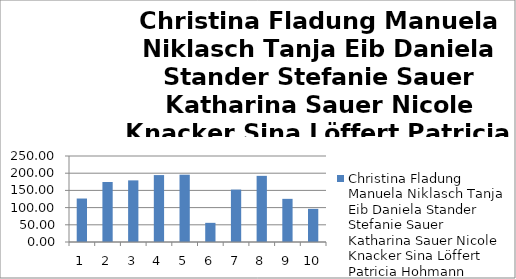
| Category | Christina Fladung Manuela Niklasch Tanja Eib Daniela Stander Stefanie Sauer Katharina Sauer Nicole Knacker Sina Löffert Patricia Hohmann Sabine Dittmer |
|---|---|
| 0 | 126.38 |
| 1 | 174.47 |
| 2 | 179.14 |
| 3 | 194.53 |
| 4 | 195.67 |
| 5 | 55.7 |
| 6 | 152.4 |
| 7 | 192.3 |
| 8 | 125.44 |
| 9 | 96.354 |